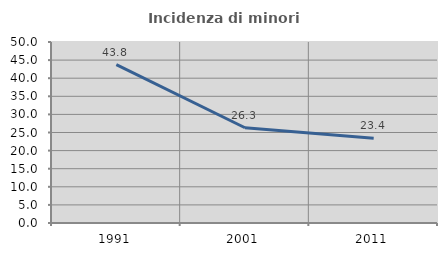
| Category | Incidenza di minori stranieri |
|---|---|
| 1991.0 | 43.75 |
| 2001.0 | 26.316 |
| 2011.0 | 23.404 |